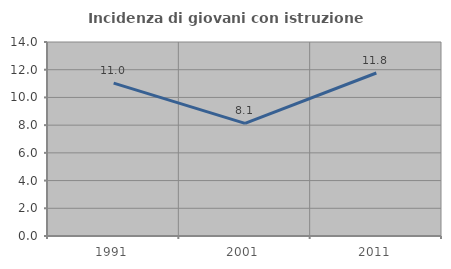
| Category | Incidenza di giovani con istruzione universitaria |
|---|---|
| 1991.0 | 11.034 |
| 2001.0 | 8.13 |
| 2011.0 | 11.765 |